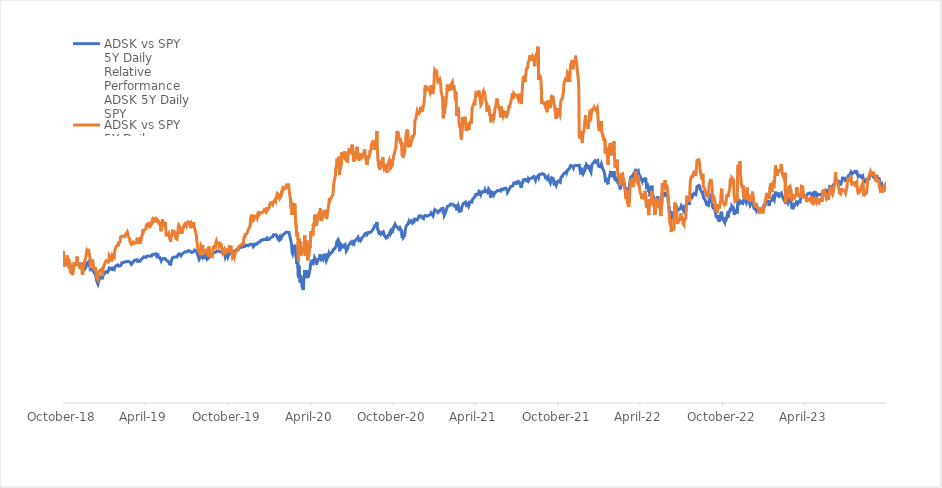
| Category | Series 0 | Series 1 |
|---|---|---|
| 2023-10-04 | 100 | 100 |
| 2023-10-03 | 99.196 | 98.174 |
| 2023-10-02 | 100.578 | 100.932 |
| 2023-09-29 | 100.57 | 99.928 |
| 2023-09-28 | 100.843 | 100.401 |
| 2023-09-27 | 100.252 | 97.691 |
| 2023-09-26 | 100.229 | 97.392 |
| 2023-09-25 | 101.728 | 99.329 |
| 2023-09-22 | 101.321 | 98.541 |
| 2023-09-21 | 101.554 | 98.551 |
| 2023-09-20 | 103.247 | 100.324 |
| 2023-09-19 | 104.226 | 102.415 |
| 2023-09-18 | 104.451 | 103.12 |
| 2023-09-15 | 104.376 | 103.038 |
| 2023-09-14 | 105.661 | 104.641 |
| 2023-09-13 | 104.777 | 102.511 |
| 2023-09-12 | 104.647 | 102.289 |
| 2023-09-11 | 105.247 | 105.641 |
| 2023-09-08 | 104.544 | 105.858 |
| 2023-09-07 | 104.395 | 106.737 |
| 2023-09-06 | 104.731 | 107.312 |
| 2023-09-05 | 105.467 | 105.989 |
| 2023-09-01 | 105.911 | 106.259 |
| 2023-08-31 | 105.721 | 107.186 |
| 2023-08-30 | 105.89 | 106.998 |
| 2023-08-29 | 105.485 | 105.96 |
| 2023-08-28 | 103.977 | 104.844 |
| 2023-08-25 | 103.329 | 104.279 |
| 2023-08-24 | 102.64 | 100.744 |
| 2023-08-23 | 104.04 | 98.696 |
| 2023-08-22 | 102.904 | 96.87 |
| 2023-08-21 | 103.19 | 97.566 |
| 2023-08-18 | 102.485 | 96.436 |
| 2023-08-17 | 102.5 | 95.963 |
| 2023-08-16 | 103.297 | 98.353 |
| 2023-08-15 | 104.083 | 101.193 |
| 2023-08-14 | 105.3 | 102.135 |
| 2023-08-11 | 104.698 | 100.435 |
| 2023-08-10 | 104.81 | 100.483 |
| 2023-08-09 | 104.784 | 98.894 |
| 2023-08-08 | 105.526 | 98.15 |
| 2023-08-07 | 105.973 | 98.385 |
| 2023-08-04 | 105.026 | 97.349 |
| 2023-08-03 | 105.585 | 97.856 |
| 2023-08-02 | 105.855 | 99.865 |
| 2023-08-01 | 107.34 | 102.603 |
| 2023-07-31 | 107.627 | 102.381 |
| 2023-07-28 | 107.469 | 101.318 |
| 2023-07-27 | 106.418 | 101.159 |
| 2023-07-26 | 107.106 | 102.748 |
| 2023-07-25 | 107.123 | 101.787 |
| 2023-07-24 | 106.822 | 101.676 |
| 2023-07-21 | 106.393 | 101.372 |
| 2023-07-20 | 106.359 | 101.888 |
| 2023-07-19 | 107.082 | 105.8 |
| 2023-07-18 | 106.83 | 104.916 |
| 2023-07-17 | 106.075 | 103.221 |
| 2023-07-14 | 105.668 | 103.419 |
| 2023-07-13 | 105.776 | 104.603 |
| 2023-07-12 | 104.888 | 103.989 |
| 2023-07-11 | 104.116 | 102.41 |
| 2023-07-10 | 103.419 | 100.13 |
| 2023-07-07 | 103.171 | 97.349 |
| 2023-07-06 | 103.467 | 97.097 |
| 2023-07-05 | 104.294 | 98.45 |
| 2023-07-03 | 104.499 | 98.377 |
| 2023-06-30 | 104.377 | 98.817 |
| 2023-06-29 | 103.112 | 99.575 |
| 2023-06-28 | 102.653 | 99.633 |
| 2023-06-27 | 102.689 | 99.899 |
| 2023-06-26 | 101.526 | 96.967 |
| 2023-06-23 | 101.984 | 97.556 |
| 2023-06-22 | 102.771 | 99.826 |
| 2023-06-21 | 102.391 | 100.444 |
| 2023-06-20 | 102.931 | 102.381 |
| 2023-06-16 | 103.42 | 103.11 |
| 2023-06-15 | 103.802 | 106.94 |
| 2023-06-14 | 102.553 | 103.134 |
| 2023-06-13 | 102.469 | 103.009 |
| 2023-06-12 | 101.763 | 100.502 |
| 2023-06-09 | 100.823 | 97.262 |
| 2023-06-08 | 100.708 | 96.668 |
| 2023-06-07 | 100.088 | 97.151 |
| 2023-06-06 | 100.471 | 100.459 |
| 2023-06-05 | 100.235 | 100.662 |
| 2023-06-02 | 100.437 | 98.638 |
| 2023-06-01 | 98.998 | 98.184 |
| 2023-05-31 | 98.032 | 96.296 |
| 2023-05-30 | 98.634 | 94.195 |
| 2023-05-26 | 98.633 | 96.059 |
| 2023-05-25 | 97.362 | 95.412 |
| 2023-05-24 | 96.517 | 95.021 |
| 2023-05-23 | 97.228 | 94.968 |
| 2023-05-22 | 98.332 | 98.276 |
| 2023-05-19 | 98.317 | 97.02 |
| 2023-05-18 | 98.459 | 98.928 |
| 2023-05-17 | 97.538 | 95.847 |
| 2023-05-16 | 96.392 | 93.33 |
| 2023-05-15 | 97.01 | 95.098 |
| 2023-05-12 | 96.724 | 93.91 |
| 2023-05-11 | 96.878 | 93.258 |
| 2023-05-10 | 97.042 | 94.813 |
| 2023-05-09 | 96.609 | 93.079 |
| 2023-05-08 | 97.054 | 92.722 |
| 2023-05-05 | 97.01 | 94.147 |
| 2023-05-04 | 95.25 | 93.224 |
| 2023-05-03 | 95.943 | 93.548 |
| 2023-05-02 | 96.619 | 92.93 |
| 2023-05-01 | 97.751 | 94.886 |
| 2023-04-28 | 97.789 | 94.074 |
| 2023-04-27 | 96.989 | 91.814 |
| 2023-04-26 | 95.127 | 91.713 |
| 2023-04-25 | 95.494 | 91.862 |
| 2023-04-24 | 97.028 | 94.581 |
| 2023-04-21 | 96.946 | 93.736 |
| 2023-04-20 | 96.858 | 94.002 |
| 2023-04-19 | 97.438 | 94.929 |
| 2023-04-18 | 97.446 | 95.359 |
| 2023-04-17 | 97.363 | 95.185 |
| 2023-04-14 | 97.042 | 94.011 |
| 2023-04-13 | 97.244 | 94.808 |
| 2023-04-12 | 95.971 | 93.287 |
| 2023-04-11 | 96.369 | 95.518 |
| 2023-04-10 | 96.373 | 95.692 |
| 2023-04-06 | 96.277 | 95.306 |
| 2023-04-05 | 95.934 | 95.407 |
| 2023-04-04 | 96.174 | 98.194 |
| 2023-04-03 | 96.734 | 100.251 |
| 2023-03-31 | 96.378 | 100.531 |
| 2023-03-30 | 95.006 | 97.368 |
| 2023-03-29 | 94.466 | 96.185 |
| 2023-03-28 | 93.14 | 95.272 |
| 2023-03-27 | 93.287 | 95.987 |
| 2023-03-24 | 93.134 | 96.697 |
| 2023-03-23 | 92.611 | 97.141 |
| 2023-03-22 | 92.336 | 95.808 |
| 2023-03-21 | 93.881 | 100.043 |
| 2023-03-20 | 92.678 | 96.793 |
| 2023-03-17 | 91.859 | 96.161 |
| 2023-03-16 | 92.883 | 96.875 |
| 2023-03-15 | 91.28 | 94.557 |
| 2023-03-14 | 91.921 | 96.214 |
| 2023-03-13 | 90.431 | 95.562 |
| 2023-03-10 | 90.568 | 93.702 |
| 2023-03-09 | 91.898 | 96.827 |
| 2023-03-08 | 93.627 | 98.768 |
| 2023-03-07 | 93.494 | 99.237 |
| 2023-03-06 | 94.95 | 100.613 |
| 2023-03-03 | 94.885 | 100.193 |
| 2023-03-02 | 93.377 | 97.136 |
| 2023-03-01 | 92.674 | 94.842 |
| 2023-02-28 | 93.114 | 95.958 |
| 2023-02-27 | 93.398 | 94.987 |
| 2023-02-24 | 93.111 | 92.983 |
| 2023-02-23 | 94.103 | 106.81 |
| 2023-02-22 | 93.604 | 104.656 |
| 2023-02-21 | 93.752 | 104.1 |
| 2023-02-17 | 95.669 | 106.24 |
| 2023-02-16 | 95.935 | 107.278 |
| 2023-02-15 | 97.276 | 110.731 |
| 2023-02-14 | 97.007 | 110.132 |
| 2023-02-13 | 97.034 | 108.181 |
| 2023-02-10 | 95.936 | 107.602 |
| 2023-02-09 | 95.726 | 108.495 |
| 2023-02-08 | 96.578 | 106.887 |
| 2023-02-07 | 97.661 | 108.012 |
| 2023-02-06 | 96.419 | 105.448 |
| 2023-02-03 | 97.015 | 108.017 |
| 2023-02-02 | 98.03 | 110.219 |
| 2023-02-01 | 96.61 | 107.307 |
| 2023-01-31 | 95.611 | 103.912 |
| 2023-01-30 | 94.231 | 100.995 |
| 2023-01-27 | 95.469 | 101.845 |
| 2023-01-26 | 95.231 | 100.676 |
| 2023-01-25 | 94.195 | 97.798 |
| 2023-01-24 | 94.212 | 99.696 |
| 2023-01-23 | 94.279 | 102.043 |
| 2023-01-20 | 93.172 | 99.44 |
| 2023-01-19 | 91.442 | 94.683 |
| 2023-01-18 | 92.146 | 95.634 |
| 2023-01-17 | 93.602 | 96.928 |
| 2023-01-13 | 93.793 | 96.875 |
| 2023-01-12 | 93.419 | 96.571 |
| 2023-01-11 | 93.101 | 96.557 |
| 2023-01-10 | 91.92 | 93.417 |
| 2023-01-09 | 91.283 | 92.954 |
| 2023-01-06 | 91.353 | 90.404 |
| 2023-01-05 | 89.313 | 87.931 |
| 2023-01-04 | 90.366 | 90.776 |
| 2023-01-03 | 89.69 | 89.419 |
| 2022-12-30 | 90.05 | 90.249 |
| 2022-12-29 | 90.279 | 90.853 |
| 2022-12-28 | 88.73 | 87.849 |
| 2022-12-27 | 89.809 | 89.969 |
| 2022-12-23 | 90.175 | 90.872 |
| 2022-12-22 | 89.649 | 90.843 |
| 2022-12-21 | 90.963 | 92.838 |
| 2022-12-20 | 89.63 | 90.756 |
| 2022-12-19 | 89.538 | 91.056 |
| 2022-12-16 | 90.351 | 92.92 |
| 2022-12-15 | 91.369 | 93.746 |
| 2022-12-14 | 93.704 | 96.619 |
| 2022-12-13 | 94.275 | 98.049 |
| 2022-12-12 | 93.593 | 96.532 |
| 2022-12-09 | 92.275 | 93.842 |
| 2022-12-08 | 92.958 | 94.963 |
| 2022-12-07 | 92.264 | 93.374 |
| 2022-12-06 | 92.436 | 93.987 |
| 2022-12-05 | 93.787 | 95.813 |
| 2022-12-02 | 95.496 | 97.126 |
| 2022-12-01 | 95.61 | 99.937 |
| 2022-11-30 | 95.693 | 97.532 |
| 2022-11-29 | 92.82 | 94.263 |
| 2022-11-28 | 92.968 | 94.345 |
| 2022-11-25 | 94.427 | 96.909 |
| 2022-11-23 | 94.453 | 95.175 |
| 2022-11-22 | 93.898 | 100.889 |
| 2022-11-21 | 92.64 | 99.73 |
| 2022-11-18 | 93.001 | 101.599 |
| 2022-11-17 | 92.561 | 103.68 |
| 2022-11-16 | 92.848 | 106.8 |
| 2022-11-15 | 93.62 | 112.19 |
| 2022-11-14 | 92.811 | 107.848 |
| 2022-11-11 | 93.648 | 110.499 |
| 2022-11-10 | 92.791 | 107.679 |
| 2022-11-09 | 87.917 | 93.987 |
| 2022-11-08 | 89.783 | 96.112 |
| 2022-11-07 | 89.283 | 94.118 |
| 2022-11-04 | 88.433 | 93.543 |
| 2022-11-03 | 87.245 | 93.799 |
| 2022-11-02 | 88.178 | 96.291 |
| 2022-11-01 | 90.439 | 103.376 |
| 2022-10-31 | 90.812 | 103.497 |
| 2022-10-28 | 91.494 | 104.506 |
| 2022-10-27 | 89.295 | 101.492 |
| 2022-10-26 | 89.841 | 103.622 |
| 2022-10-25 | 90.51 | 104.182 |
| 2022-10-24 | 89.061 | 100.014 |
| 2022-10-21 | 88.015 | 97.262 |
| 2022-10-20 | 85.975 | 95.542 |
| 2022-10-19 | 86.665 | 95.151 |
| 2022-10-18 | 87.247 | 96.928 |
| 2022-10-17 | 86.261 | 95.963 |
| 2022-10-14 | 84.036 | 91.669 |
| 2022-10-13 | 86.072 | 93.62 |
| 2022-10-12 | 83.894 | 93.519 |
| 2022-10-11 | 84.171 | 92.258 |
| 2022-10-10 | 84.723 | 92.258 |
| 2022-10-07 | 85.363 | 94.05 |
| 2022-10-06 | 87.822 | 99.425 |
| 2022-10-05 | 88.731 | 98.778 |
| 2022-10-04 | 88.911 | 96.586 |
| 2022-10-03 | 86.272 | 92.949 |
| 2022-09-30 | 84.095 | 90.215 |
| 2022-09-29 | 85.382 | 91.5 |
| 2022-09-28 | 87.225 | 92.234 |
| 2022-09-27 | 85.542 | 90.776 |
| 2022-09-26 | 85.724 | 88.858 |
| 2022-09-23 | 86.619 | 89.134 |
| 2022-09-22 | 88.138 | 90.384 |
| 2022-09-21 | 88.887 | 92.93 |
| 2022-09-20 | 90.435 | 94.161 |
| 2022-09-19 | 91.466 | 95.088 |
| 2022-09-16 | 90.843 | 94.161 |
| 2022-09-15 | 91.5 | 97.218 |
| 2022-09-14 | 92.548 | 100.705 |
| 2022-09-13 | 92.235 | 100.618 |
| 2022-09-12 | 96.404 | 103.912 |
| 2022-09-09 | 95.394 | 102.231 |
| 2022-09-08 | 93.959 | 101.333 |
| 2022-09-07 | 93.342 | 99.58 |
| 2022-09-06 | 91.661 | 95.711 |
| 2022-09-02 | 92.038 | 95.958 |
| 2022-09-01 | 93.037 | 97.532 |
| 2022-08-31 | 92.759 | 97.431 |
| 2022-08-30 | 93.49 | 97.947 |
| 2022-08-29 | 94.532 | 99.348 |
| 2022-08-26 | 95.166 | 100.343 |
| 2022-08-25 | 98.484 | 106.322 |
| 2022-08-24 | 97.116 | 103.559 |
| 2022-08-23 | 96.833 | 103.173 |
| 2022-08-22 | 97.05 | 104.511 |
| 2022-08-19 | 99.173 | 107.5 |
| 2022-08-18 | 100.469 | 110.528 |
| 2022-08-17 | 100.241 | 110.21 |
| 2022-08-16 | 100.972 | 112.837 |
| 2022-08-15 | 100.783 | 113.03 |
| 2022-08-12 | 100.385 | 112.533 |
| 2022-08-11 | 98.675 | 109.756 |
| 2022-08-10 | 98.745 | 109.302 |
| 2022-08-09 | 96.686 | 105.351 |
| 2022-08-08 | 97.099 | 106.583 |
| 2022-08-05 | 97.219 | 107.07 |
| 2022-08-04 | 97.378 | 107.186 |
| 2022-08-03 | 97.453 | 105.496 |
| 2022-08-02 | 95.953 | 104.405 |
| 2022-08-01 | 96.596 | 105.351 |
| 2022-07-29 | 96.87 | 104.472 |
| 2022-07-28 | 95.513 | 102.463 |
| 2022-07-27 | 94.368 | 98.237 |
| 2022-07-26 | 91.962 | 93.244 |
| 2022-07-25 | 93.036 | 94.518 |
| 2022-07-22 | 92.914 | 94.634 |
| 2022-07-21 | 93.79 | 96.156 |
| 2022-07-20 | 92.874 | 94.842 |
| 2022-07-19 | 92.329 | 89.23 |
| 2022-07-18 | 89.847 | 85.589 |
| 2022-07-15 | 90.605 | 85.101 |
| 2022-07-14 | 88.898 | 82.565 |
| 2022-07-13 | 89.165 | 82.561 |
| 2022-07-12 | 89.564 | 83.227 |
| 2022-07-11 | 90.4 | 85.347 |
| 2022-07-08 | 91.454 | 86.849 |
| 2022-07-07 | 91.53 | 88.018 |
| 2022-07-06 | 90.181 | 85.352 |
| 2022-07-05 | 89.86 | 85.434 |
| 2022-07-01 | 89.718 | 83.966 |
| 2022-06-30 | 88.781 | 83.048 |
| 2022-06-29 | 89.565 | 85.41 |
| 2022-06-28 | 89.629 | 85.391 |
| 2022-06-27 | 91.471 | 89.766 |
| 2022-06-24 | 91.744 | 92.959 |
| 2022-06-23 | 89.023 | 88.578 |
| 2022-06-22 | 88.183 | 81.691 |
| 2022-06-21 | 88.298 | 80.595 |
| 2022-06-17 | 86.188 | 81.025 |
| 2022-06-16 | 85.999 | 79.354 |
| 2022-06-15 | 88.889 | 85.342 |
| 2022-06-14 | 87.61 | 82.87 |
| 2022-06-13 | 87.942 | 83.599 |
| 2022-06-10 | 91.489 | 90.351 |
| 2022-06-09 | 94.232 | 94.205 |
| 2022-06-08 | 96.529 | 98.392 |
| 2022-06-07 | 97.583 | 100.053 |
| 2022-06-06 | 96.662 | 100.744 |
| 2022-06-03 | 96.36 | 100.633 |
| 2022-06-02 | 97.961 | 103.395 |
| 2022-06-01 | 96.188 | 100.155 |
| 2022-05-31 | 96.914 | 100.333 |
| 2022-05-27 | 97.525 | 102.086 |
| 2022-05-26 | 95.171 | 92.548 |
| 2022-05-25 | 93.315 | 90.085 |
| 2022-05-24 | 92.442 | 86.714 |
| 2022-05-23 | 93.198 | 88.626 |
| 2022-05-20 | 91.501 | 92.442 |
| 2022-05-19 | 91.487 | 93.557 |
| 2022-05-18 | 92.024 | 90.785 |
| 2022-05-17 | 95.898 | 94.485 |
| 2022-05-16 | 94.002 | 93.007 |
| 2022-05-13 | 94.374 | 95.175 |
| 2022-05-12 | 92.174 | 89.37 |
| 2022-05-11 | 92.294 | 87.26 |
| 2022-05-10 | 93.839 | 90.027 |
| 2022-05-09 | 93.609 | 89.984 |
| 2022-05-06 | 96.707 | 93.582 |
| 2022-05-05 | 97.259 | 95.813 |
| 2022-05-04 | 100.854 | 98.401 |
| 2022-05-03 | 97.93 | 93.316 |
| 2022-05-02 | 97.458 | 93.161 |
| 2022-04-29 | 96.908 | 91.413 |
| 2022-04-28 | 100.557 | 94.581 |
| 2022-04-27 | 98.129 | 87.158 |
| 2022-04-26 | 97.923 | 89.631 |
| 2022-04-25 | 100.759 | 92.316 |
| 2022-04-22 | 100.188 | 90.462 |
| 2022-04-21 | 103.047 | 94.238 |
| 2022-04-20 | 104.59 | 97.518 |
| 2022-04-19 | 104.655 | 98.426 |
| 2022-04-18 | 103.001 | 94.919 |
| 2022-04-14 | 103.022 | 95.011 |
| 2022-04-13 | 104.288 | 97.431 |
| 2022-04-12 | 103.136 | 94.726 |
| 2022-04-11 | 103.489 | 96.122 |
| 2022-04-08 | 105.266 | 97.677 |
| 2022-04-07 | 105.546 | 98.894 |
| 2022-04-06 | 105.099 | 98.493 |
| 2022-04-05 | 106.13 | 102.168 |
| 2022-04-04 | 107.479 | 105.655 |
| 2022-04-01 | 106.616 | 102.888 |
| 2022-03-31 | 106.254 | 103.521 |
| 2022-03-30 | 107.944 | 106.732 |
| 2022-03-29 | 108.627 | 107.698 |
| 2022-03-28 | 107.312 | 104.033 |
| 2022-03-25 | 106.551 | 102.453 |
| 2022-03-24 | 106.014 | 102.893 |
| 2022-03-23 | 104.515 | 100.135 |
| 2022-03-22 | 105.813 | 104.636 |
| 2022-03-21 | 104.63 | 102.569 |
| 2022-03-18 | 104.676 | 103.014 |
| 2022-03-17 | 103.469 | 102.217 |
| 2022-03-16 | 102.207 | 98.764 |
| 2022-03-15 | 99.97 | 92.934 |
| 2022-03-14 | 97.874 | 91.133 |
| 2022-03-11 | 98.606 | 92.876 |
| 2022-03-10 | 99.901 | 96.489 |
| 2022-03-09 | 100.331 | 98.947 |
| 2022-03-08 | 97.818 | 94.634 |
| 2022-03-07 | 98.53 | 96.151 |
| 2022-03-04 | 101.527 | 100.29 |
| 2022-03-03 | 102.339 | 101.42 |
| 2022-03-02 | 102.88 | 104.564 |
| 2022-03-01 | 100.997 | 103.352 |
| 2022-02-28 | 102.584 | 106.36 |
| 2022-02-25 | 102.836 | 106.066 |
| 2022-02-24 | 100.585 | 105.37 |
| 2022-02-23 | 99.103 | 100.947 |
| 2022-02-22 | 100.962 | 104.149 |
| 2022-02-18 | 101.996 | 104.723 |
| 2022-02-17 | 102.733 | 107.887 |
| 2022-02-16 | 104.955 | 112.885 |
| 2022-02-15 | 104.862 | 112.711 |
| 2022-02-14 | 103.235 | 109.582 |
| 2022-02-11 | 103.633 | 109.693 |
| 2022-02-10 | 105.637 | 115.194 |
| 2022-02-09 | 107.586 | 121.385 |
| 2022-02-08 | 106.046 | 116.44 |
| 2022-02-07 | 105.163 | 116.14 |
| 2022-02-04 | 105.553 | 116.507 |
| 2022-02-03 | 105.012 | 114.827 |
| 2022-02-02 | 107.637 | 119.772 |
| 2022-02-01 | 106.632 | 120.627 |
| 2022-01-31 | 105.906 | 120.637 |
| 2022-01-28 | 103.943 | 115.686 |
| 2022-01-27 | 101.472 | 110.432 |
| 2022-01-26 | 102.021 | 112.663 |
| 2022-01-25 | 102.174 | 112.904 |
| 2022-01-24 | 103.433 | 118.492 |
| 2022-01-21 | 103.147 | 115.517 |
| 2022-01-20 | 105.136 | 121.902 |
| 2022-01-19 | 106.309 | 122.839 |
| 2022-01-18 | 107.349 | 121.718 |
| 2022-01-14 | 109.36 | 125.133 |
| 2022-01-13 | 109.271 | 125.65 |
| 2022-01-12 | 110.85 | 130.204 |
| 2022-01-11 | 110.538 | 130.701 |
| 2022-01-10 | 109.535 | 126.722 |
| 2022-01-07 | 109.693 | 126.688 |
| 2022-01-06 | 110.139 | 127.552 |
| 2022-01-05 | 110.245 | 127.654 |
| 2022-01-04 | 112.425 | 134.352 |
| 2022-01-03 | 112.496 | 137.023 |
| 2021-12-31 | 111.784 | 135.801 |
| 2021-12-30 | 112.078 | 136.052 |
| 2021-12-29 | 112.414 | 136.468 |
| 2021-12-28 | 112.257 | 136.564 |
| 2021-12-27 | 112.37 | 137.303 |
| 2021-12-23 | 110.836 | 135.705 |
| 2021-12-22 | 110.151 | 136.487 |
| 2021-12-21 | 109.041 | 135.429 |
| 2021-12-20 | 107.136 | 132.87 |
| 2021-12-17 | 108.37 | 134.092 |
| 2021-12-16 | 109.497 | 130.209 |
| 2021-12-15 | 110.463 | 131.232 |
| 2021-12-14 | 108.686 | 127.123 |
| 2021-12-13 | 109.504 | 129.856 |
| 2021-12-10 | 110.514 | 129.914 |
| 2021-12-09 | 109.468 | 129.272 |
| 2021-12-08 | 110.26 | 133.435 |
| 2021-12-07 | 109.921 | 133.633 |
| 2021-12-06 | 107.691 | 128.253 |
| 2021-12-03 | 106.442 | 125.094 |
| 2021-12-02 | 107.349 | 124.437 |
| 2021-12-01 | 105.847 | 120.583 |
| 2021-11-30 | 107.112 | 122.762 |
| 2021-11-29 | 109.183 | 126.123 |
| 2021-11-26 | 107.76 | 122.752 |
| 2021-11-24 | 110.266 | 124.07 |
| 2021-11-23 | 110.013 | 146.817 |
| 2021-11-22 | 109.831 | 149.947 |
| 2021-11-19 | 110.184 | 155.762 |
| 2021-11-18 | 110.338 | 155.597 |
| 2021-11-17 | 109.966 | 159.64 |
| 2021-11-16 | 110.253 | 161.132 |
| 2021-11-15 | 109.828 | 157.631 |
| 2021-11-12 | 109.829 | 159.046 |
| 2021-11-11 | 109.042 | 157.061 |
| 2021-11-10 | 108.982 | 154.801 |
| 2021-11-09 | 109.886 | 159.084 |
| 2021-11-08 | 110.271 | 158.925 |
| 2021-11-05 | 110.174 | 156.728 |
| 2021-11-04 | 109.764 | 154.047 |
| 2021-11-03 | 109.307 | 148.928 |
| 2021-11-02 | 108.605 | 152.091 |
| 2021-11-01 | 108.207 | 152.135 |
| 2021-10-29 | 108.012 | 153.39 |
| 2021-10-28 | 107.802 | 153.144 |
| 2021-10-27 | 106.753 | 148.995 |
| 2021-10-26 | 107.295 | 151.067 |
| 2021-10-25 | 107.1 | 150.58 |
| 2021-10-22 | 106.594 | 149.029 |
| 2021-10-21 | 106.708 | 147.629 |
| 2021-10-20 | 106.39 | 144.229 |
| 2021-10-19 | 106.001 | 143.287 |
| 2021-10-18 | 105.223 | 141.346 |
| 2021-10-15 | 104.869 | 140.631 |
| 2021-10-14 | 104.093 | 139.655 |
| 2021-10-13 | 102.347 | 136.893 |
| 2021-10-12 | 102.038 | 133.251 |
| 2021-10-11 | 102.285 | 133.555 |
| 2021-10-08 | 102.992 | 134.715 |
| 2021-10-07 | 103.19 | 136.685 |
| 2021-10-06 | 102.341 | 133.98 |
| 2021-10-05 | 101.922 | 133.285 |
| 2021-10-04 | 100.861 | 131.812 |
| 2021-10-01 | 102.188 | 137.187 |
| 2021-09-30 | 101.027 | 137.723 |
| 2021-09-29 | 102.245 | 139.085 |
| 2021-09-28 | 102.085 | 139.018 |
| 2021-09-27 | 104.207 | 142.017 |
| 2021-09-24 | 104.497 | 142.311 |
| 2021-09-23 | 104.344 | 141.099 |
| 2021-09-22 | 103.093 | 138.327 |
| 2021-09-21 | 102.121 | 136.767 |
| 2021-09-20 | 102.204 | 136.965 |
| 2021-09-17 | 103.969 | 139.163 |
| 2021-09-16 | 104.925 | 140.384 |
| 2021-09-15 | 105.088 | 138.424 |
| 2021-09-14 | 104.205 | 134.913 |
| 2021-09-13 | 104.808 | 135.845 |
| 2021-09-10 | 104.569 | 137.366 |
| 2021-09-09 | 105.383 | 138.936 |
| 2021-09-08 | 105.871 | 139.844 |
| 2021-09-07 | 106.011 | 138.829 |
| 2021-09-03 | 106.372 | 139.452 |
| 2021-09-02 | 106.408 | 138.834 |
| 2021-09-01 | 106.106 | 146.45 |
| 2021-08-31 | 106.073 | 149.759 |
| 2021-08-30 | 106.216 | 151.352 |
| 2021-08-27 | 105.761 | 152.439 |
| 2021-08-26 | 104.837 | 149.807 |
| 2021-08-25 | 105.452 | 165.3 |
| 2021-08-24 | 105.218 | 164.72 |
| 2021-08-23 | 105.061 | 162.639 |
| 2021-08-20 | 104.173 | 161.489 |
| 2021-08-19 | 103.332 | 159.543 |
| 2021-08-18 | 103.202 | 156.245 |
| 2021-08-17 | 104.323 | 156.814 |
| 2021-08-16 | 105.065 | 159.461 |
| 2021-08-13 | 104.79 | 160.717 |
| 2021-08-12 | 104.622 | 160.364 |
| 2021-08-11 | 104.314 | 158.717 |
| 2021-08-10 | 104.057 | 159.992 |
| 2021-08-09 | 103.954 | 160.712 |
| 2021-08-06 | 104.052 | 160.712 |
| 2021-08-05 | 103.878 | 158.804 |
| 2021-08-04 | 103.258 | 158.935 |
| 2021-08-03 | 103.738 | 158.22 |
| 2021-08-02 | 102.894 | 155.544 |
| 2021-07-30 | 103.084 | 155.09 |
| 2021-07-29 | 103.645 | 154.786 |
| 2021-07-28 | 103.211 | 151.227 |
| 2021-07-27 | 103.23 | 148.87 |
| 2021-07-26 | 103.719 | 151.463 |
| 2021-07-23 | 103.472 | 150.995 |
| 2021-07-22 | 102.433 | 148.995 |
| 2021-07-21 | 102.227 | 145.745 |
| 2021-07-20 | 101.391 | 143.012 |
| 2021-07-19 | 99.877 | 138.757 |
| 2021-07-16 | 101.487 | 141.664 |
| 2021-07-15 | 102.258 | 142.369 |
| 2021-07-14 | 102.593 | 143.485 |
| 2021-07-13 | 102.473 | 143.157 |
| 2021-07-12 | 102.835 | 140.988 |
| 2021-07-09 | 102.481 | 142.654 |
| 2021-07-08 | 101.338 | 142.215 |
| 2021-07-07 | 102.214 | 143.007 |
| 2021-07-06 | 101.871 | 142.761 |
| 2021-07-02 | 102.078 | 143.794 |
| 2021-07-01 | 101.318 | 141.843 |
| 2021-06-30 | 100.792 | 140.974 |
| 2021-06-29 | 100.658 | 143.794 |
| 2021-06-28 | 100.63 | 141.679 |
| 2021-06-25 | 100.398 | 139.448 |
| 2021-06-24 | 100.064 | 138.588 |
| 2021-06-23 | 99.486 | 136.999 |
| 2021-06-22 | 99.594 | 138.158 |
| 2021-06-21 | 99.086 | 136.782 |
| 2021-06-18 | 97.718 | 134.251 |
| 2021-06-17 | 99.018 | 133.459 |
| 2021-06-16 | 99.061 | 132.189 |
| 2021-06-15 | 99.598 | 133.662 |
| 2021-06-14 | 99.798 | 135.478 |
| 2021-06-11 | 99.617 | 134.024 |
| 2021-06-10 | 99.424 | 134.019 |
| 2021-06-09 | 98.963 | 133.053 |
| 2021-06-08 | 99.144 | 134.579 |
| 2021-06-07 | 99.127 | 134.69 |
| 2021-06-04 | 99.206 | 137.535 |
| 2021-06-03 | 98.337 | 132.556 |
| 2021-06-02 | 98.695 | 135.067 |
| 2021-06-01 | 98.553 | 135.854 |
| 2021-05-28 | 98.601 | 138.057 |
| 2021-05-27 | 98.525 | 138.448 |
| 2021-05-26 | 98.411 | 141.268 |
| 2021-05-25 | 98.226 | 139.8 |
| 2021-05-24 | 98.436 | 138.839 |
| 2021-05-21 | 97.47 | 136.038 |
| 2021-05-20 | 97.546 | 135.787 |
| 2021-05-19 | 96.527 | 132.314 |
| 2021-05-18 | 96.812 | 131.725 |
| 2021-05-17 | 97.644 | 132.705 |
| 2021-05-14 | 97.892 | 134.082 |
| 2021-05-13 | 96.453 | 130.262 |
| 2021-05-12 | 95.293 | 130.175 |
| 2021-05-11 | 97.381 | 133.98 |
| 2021-05-10 | 98.233 | 133.319 |
| 2021-05-07 | 99.269 | 138.008 |
| 2021-05-06 | 98.543 | 137.327 |
| 2021-05-05 | 97.745 | 135.748 |
| 2021-05-04 | 97.676 | 135.096 |
| 2021-05-03 | 98.333 | 138.849 |
| 2021-04-30 | 98.063 | 140.978 |
| 2021-04-29 | 98.774 | 143.089 |
| 2021-04-28 | 98.11 | 144.514 |
| 2021-04-27 | 98.193 | 143.857 |
| 2021-04-26 | 98.214 | 144.567 |
| 2021-04-23 | 98.04 | 142.601 |
| 2021-04-22 | 96.98 | 139.09 |
| 2021-04-21 | 97.881 | 139.51 |
| 2021-04-20 | 96.979 | 138.298 |
| 2021-04-19 | 97.643 | 140.153 |
| 2021-04-16 | 98.164 | 144.963 |
| 2021-04-15 | 97.811 | 144.335 |
| 2021-04-14 | 96.738 | 142.157 |
| 2021-04-13 | 97.135 | 142.64 |
| 2021-04-12 | 96.816 | 142.229 |
| 2021-04-09 | 96.835 | 143.712 |
| 2021-04-08 | 96.093 | 141.713 |
| 2021-04-07 | 95.689 | 138.182 |
| 2021-04-06 | 95.548 | 137.883 |
| 2021-04-05 | 95.641 | 139.245 |
| 2021-04-01 | 94.28 | 137.11 |
| 2021-03-31 | 93.178 | 133.85 |
| 2021-03-30 | 92.842 | 129.639 |
| 2021-03-29 | 93.136 | 130.774 |
| 2021-03-26 | 93.217 | 129.919 |
| 2021-03-25 | 91.692 | 126.625 |
| 2021-03-24 | 91.214 | 127.103 |
| 2021-03-23 | 91.716 | 129.914 |
| 2021-03-22 | 92.421 | 128.446 |
| 2021-03-19 | 91.776 | 126.292 |
| 2021-03-18 | 91.831 | 127.229 |
| 2021-03-17 | 93.207 | 131.769 |
| 2021-03-16 | 92.94 | 132.817 |
| 2021-03-15 | 93.086 | 131.856 |
| 2021-03-12 | 92.485 | 129.484 |
| 2021-03-11 | 92.391 | 132.503 |
| 2021-03-10 | 91.441 | 127.325 |
| 2021-03-09 | 90.893 | 127.485 |
| 2021-03-08 | 89.624 | 122.235 |
| 2021-03-05 | 90.107 | 129.136 |
| 2021-03-04 | 88.384 | 128.195 |
| 2021-03-03 | 89.586 | 130.059 |
| 2021-03-02 | 90.772 | 134.222 |
| 2021-03-01 | 91.511 | 137.289 |
| 2021-02-26 | 89.385 | 133.295 |
| 2021-02-25 | 89.812 | 137.173 |
| 2021-02-24 | 92.065 | 144.359 |
| 2021-02-23 | 91.032 | 140.177 |
| 2021-02-22 | 90.918 | 143.775 |
| 2021-02-19 | 91.626 | 147.493 |
| 2021-02-18 | 91.796 | 145.233 |
| 2021-02-17 | 92.204 | 146.103 |
| 2021-02-16 | 92.233 | 148.855 |
| 2021-02-12 | 92.286 | 147.368 |
| 2021-02-11 | 91.853 | 144.987 |
| 2021-02-10 | 91.7 | 145.711 |
| 2021-02-09 | 91.732 | 147.059 |
| 2021-02-08 | 91.834 | 146.243 |
| 2021-02-05 | 91.16 | 147.716 |
| 2021-02-04 | 90.806 | 145.122 |
| 2021-02-03 | 89.831 | 141.432 |
| 2021-02-02 | 89.74 | 142.282 |
| 2021-02-01 | 88.51 | 138.279 |
| 2021-01-29 | 87.112 | 133.985 |
| 2021-01-28 | 88.827 | 137.265 |
| 2021-01-27 | 87.969 | 132.073 |
| 2021-01-26 | 90.287 | 140.901 |
| 2021-01-25 | 90.422 | 141.814 |
| 2021-01-22 | 90.096 | 144.485 |
| 2021-01-21 | 90.368 | 148.005 |
| 2021-01-20 | 90.339 | 149.029 |
| 2021-01-19 | 89.098 | 150.184 |
| 2021-01-15 | 88.379 | 148.995 |
| 2021-01-14 | 89.019 | 150.251 |
| 2021-01-13 | 89.354 | 151.806 |
| 2021-01-12 | 89.151 | 154.607 |
| 2021-01-11 | 89.114 | 153.487 |
| 2021-01-08 | 89.702 | 154.472 |
| 2021-01-07 | 89.212 | 152.226 |
| 2021-01-06 | 87.907 | 146.272 |
| 2021-01-05 | 87.408 | 145.707 |
| 2021-01-04 | 86.793 | 143.359 |
| 2020-12-31 | 88.093 | 147.465 |
| 2020-12-30 | 87.53 | 144.601 |
| 2020-12-29 | 87.412 | 143.973 |
| 2020-12-28 | 87.607 | 144.717 |
| 2020-12-24 | 86.85 | 145.557 |
| 2020-12-23 | 86.544 | 144.972 |
| 2020-12-22 | 86.479 | 146.75 |
| 2020-12-21 | 86.659 | 145.311 |
| 2020-12-18 | 86.999 | 147.3 |
| 2020-12-17 | 87.305 | 143.606 |
| 2020-12-16 | 86.806 | 141.104 |
| 2020-12-15 | 86.652 | 138.863 |
| 2020-12-14 | 85.547 | 139.249 |
| 2020-12-11 | 85.921 | 135.072 |
| 2020-12-10 | 86.03 | 135.787 |
| 2020-12-09 | 86.141 | 134.946 |
| 2020-12-08 | 86.831 | 137.342 |
| 2020-12-07 | 86.59 | 135.613 |
| 2020-12-04 | 86.757 | 134.261 |
| 2020-12-03 | 85.998 | 133.918 |
| 2020-12-02 | 86.051 | 133.807 |
| 2020-12-01 | 85.897 | 134.797 |
| 2020-11-30 | 84.94 | 135.338 |
| 2020-11-27 | 85.332 | 131.754 |
| 2020-11-25 | 85.128 | 130.996 |
| 2020-11-24 | 85.263 | 125.07 |
| 2020-11-23 | 83.907 | 124.239 |
| 2020-11-20 | 83.437 | 123.1 |
| 2020-11-19 | 84.008 | 124.061 |
| 2020-11-18 | 83.677 | 121.81 |
| 2020-11-17 | 84.656 | 122.047 |
| 2020-11-16 | 85.064 | 120.154 |
| 2020-11-13 | 84.084 | 121.221 |
| 2020-11-12 | 82.955 | 118.666 |
| 2020-11-11 | 83.791 | 119.188 |
| 2020-11-10 | 83.155 | 119.395 |
| 2020-11-09 | 83.272 | 126.828 |
| 2020-11-06 | 82.309 | 125.283 |
| 2020-11-05 | 82.332 | 123.597 |
| 2020-11-04 | 80.761 | 118.753 |
| 2020-11-03 | 79.015 | 119.922 |
| 2020-11-02 | 77.637 | 116.266 |
| 2020-10-30 | 76.692 | 113.754 |
| 2020-10-29 | 77.634 | 117.28 |
| 2020-10-28 | 76.717 | 114.759 |
| 2020-10-27 | 79.523 | 121.028 |
| 2020-10-26 | 79.765 | 120.318 |
| 2020-10-23 | 81.276 | 122.873 |
| 2020-10-22 | 80.997 | 122.071 |
| 2020-10-21 | 80.576 | 122.675 |
| 2020-10-20 | 80.753 | 124.283 |
| 2020-10-19 | 80.373 | 125.538 |
| 2020-10-16 | 81.708 | 125.553 |
| 2020-10-15 | 81.697 | 121.718 |
| 2020-10-14 | 81.822 | 119.144 |
| 2020-10-13 | 82.367 | 117.884 |
| 2020-10-12 | 82.89 | 116.932 |
| 2020-10-09 | 81.551 | 114.701 |
| 2020-10-08 | 80.84 | 113.16 |
| 2020-10-07 | 80.198 | 112.533 |
| 2020-10-06 | 78.826 | 110.118 |
| 2020-10-05 | 79.944 | 110.562 |
| 2020-10-02 | 78.533 | 108.935 |
| 2020-10-01 | 79.292 | 112.991 |
| 2020-09-30 | 78.874 | 111.567 |
| 2020-09-29 | 78.229 | 112.489 |
| 2020-09-28 | 78.607 | 112.117 |
| 2020-09-25 | 77.361 | 110.016 |
| 2020-09-24 | 76.144 | 106.713 |
| 2020-09-23 | 75.917 | 107.153 |
| 2020-09-22 | 77.762 | 110.866 |
| 2020-09-21 | 76.952 | 109.939 |
| 2020-09-18 | 77.853 | 108.727 |
| 2020-09-17 | 78.734 | 109.616 |
| 2020-09-16 | 79.402 | 111.446 |
| 2020-09-15 | 79.77 | 113.914 |
| 2020-09-14 | 79.356 | 110.997 |
| 2020-09-11 | 78.358 | 109.862 |
| 2020-09-10 | 78.316 | 110.21 |
| 2020-09-09 | 79.718 | 112.422 |
| 2020-09-08 | 78.143 | 108.355 |
| 2020-09-04 | 80.374 | 112.953 |
| 2020-09-03 | 81.033 | 116.918 |
| 2020-09-02 | 83.983 | 126.219 |
| 2020-09-01 | 82.712 | 122.433 |
| 2020-08-31 | 82.095 | 118.661 |
| 2020-08-28 | 82.275 | 119.477 |
| 2020-08-27 | 81.725 | 117.41 |
| 2020-08-26 | 81.589 | 119.873 |
| 2020-08-25 | 80.765 | 121.82 |
| 2020-08-24 | 80.476 | 121.607 |
| 2020-08-21 | 79.675 | 119.902 |
| 2020-08-20 | 79.402 | 120.327 |
| 2020-08-19 | 79.152 | 116.594 |
| 2020-08-18 | 79.502 | 117.208 |
| 2020-08-17 | 79.32 | 115.425 |
| 2020-08-14 | 79.105 | 113.18 |
| 2020-08-13 | 79.119 | 115.034 |
| 2020-08-12 | 79.281 | 111.837 |
| 2020-08-11 | 78.187 | 110.495 |
| 2020-08-10 | 78.815 | 111.987 |
| 2020-08-07 | 78.599 | 114.093 |
| 2020-08-06 | 78.55 | 117.633 |
| 2020-08-05 | 78.048 | 117.454 |
| 2020-08-04 | 77.549 | 115.86 |
| 2020-08-03 | 77.27 | 115.657 |
| 2020-07-31 | 76.719 | 114.184 |
| 2020-07-30 | 76.135 | 114.025 |
| 2020-07-29 | 76.422 | 115.237 |
| 2020-07-28 | 75.484 | 113.291 |
| 2020-07-27 | 75.976 | 115.759 |
| 2020-07-24 | 75.418 | 112.47 |
| 2020-07-23 | 75.888 | 114.624 |
| 2020-07-22 | 76.834 | 116.266 |
| 2020-07-21 | 76.395 | 115.759 |
| 2020-07-20 | 76.267 | 118.825 |
| 2020-07-17 | 75.631 | 114.798 |
| 2020-07-16 | 75.416 | 113.025 |
| 2020-07-15 | 75.674 | 113.774 |
| 2020-07-14 | 74.993 | 113.3 |
| 2020-07-13 | 74.001 | 111.977 |
| 2020-07-10 | 74.7 | 117.956 |
| 2020-07-09 | 73.927 | 119.869 |
| 2020-07-08 | 74.346 | 117.792 |
| 2020-07-07 | 73.769 | 115.397 |
| 2020-07-06 | 74.576 | 118.014 |
| 2020-07-02 | 73.41 | 115.981 |
| 2020-07-01 | 73.078 | 116.498 |
| 2020-06-30 | 72.713 | 115.517 |
| 2020-06-29 | 71.609 | 112.127 |
| 2020-06-26 | 70.573 | 112.402 |
| 2020-06-25 | 72.325 | 113.238 |
| 2020-06-24 | 71.541 | 112.74 |
| 2020-06-23 | 73.44 | 116.691 |
| 2020-06-22 | 73.125 | 116.333 |
| 2020-06-19 | 72.653 | 114.856 |
| 2020-06-18 | 73.066 | 114.976 |
| 2020-06-17 | 73.022 | 114.479 |
| 2020-06-16 | 73.286 | 116.358 |
| 2020-06-15 | 71.922 | 110.596 |
| 2020-06-12 | 71.329 | 107.679 |
| 2020-06-11 | 70.41 | 105.815 |
| 2020-06-10 | 74.82 | 114.262 |
| 2020-06-09 | 75.22 | 113.083 |
| 2020-06-08 | 75.811 | 112.774 |
| 2020-06-05 | 74.909 | 112.871 |
| 2020-06-04 | 72.996 | 108.761 |
| 2020-06-03 | 73.242 | 109.335 |
| 2020-06-02 | 72.256 | 105.81 |
| 2020-06-01 | 71.668 | 105.907 |
| 2020-05-29 | 71.4 | 101.603 |
| 2020-05-28 | 71.058 | 97.861 |
| 2020-05-27 | 71.208 | 96.499 |
| 2020-05-26 | 70.168 | 96.363 |
| 2020-05-22 | 69.316 | 94.552 |
| 2020-05-21 | 69.153 | 94.055 |
| 2020-05-20 | 69.695 | 94.968 |
| 2020-05-19 | 68.553 | 94.036 |
| 2020-05-18 | 69.28 | 91.809 |
| 2020-05-15 | 67.164 | 87.279 |
| 2020-05-14 | 66.901 | 85.903 |
| 2020-05-13 | 66.139 | 85.415 |
| 2020-05-12 | 67.314 | 87.4 |
| 2020-05-11 | 68.726 | 89.056 |
| 2020-05-08 | 68.714 | 89.003 |
| 2020-05-07 | 67.574 | 88.863 |
| 2020-05-06 | 66.806 | 87.525 |
| 2020-05-05 | 67.275 | 87.168 |
| 2020-05-04 | 66.672 | 85.869 |
| 2020-05-01 | 66.39 | 84.468 |
| 2020-04-30 | 68.307 | 90.375 |
| 2020-04-29 | 68.942 | 90.747 |
| 2020-04-28 | 67.157 | 85.632 |
| 2020-04-27 | 67.511 | 88.144 |
| 2020-04-24 | 66.532 | 87.1 |
| 2020-04-23 | 65.618 | 84.782 |
| 2020-04-22 | 65.654 | 84.695 |
| 2020-04-21 | 64.182 | 82.111 |
| 2020-04-20 | 66.213 | 85.903 |
| 2020-04-17 | 67.419 | 87.385 |
| 2020-04-16 | 65.659 | 82.585 |
| 2020-04-15 | 65.28 | 81.686 |
| 2020-04-14 | 66.75 | 83.174 |
| 2020-04-13 | 64.77 | 77.717 |
| 2020-04-09 | 65.431 | 79.639 |
| 2020-04-08 | 64.497 | 76.891 |
| 2020-04-07 | 62.373 | 71.815 |
| 2020-04-06 | 62.473 | 73.563 |
| 2020-04-03 | 58.368 | 67.13 |
| 2020-04-02 | 59.265 | 66.189 |
| 2020-04-01 | 57.942 | 67.237 |
| 2020-03-31 | 60.618 | 75.389 |
| 2020-03-30 | 61.604 | 75.297 |
| 2020-03-27 | 59.606 | 68.371 |
| 2020-03-26 | 61.684 | 77.697 |
| 2020-03-25 | 58.061 | 72.438 |
| 2020-03-24 | 57.399 | 72.423 |
| 2020-03-23 | 52.475 | 69.613 |
| 2020-03-20 | 54.059 | 71.487 |
| 2020-03-19 | 56.509 | 72.071 |
| 2020-03-18 | 56.244 | 68.492 |
| 2020-03-17 | 59.318 | 74.819 |
| 2020-03-16 | 55.963 | 71.516 |
| 2020-03-13 | 63.583 | 76.321 |
| 2020-03-12 | 58.18 | 65.681 |
| 2020-03-11 | 64.295 | 74.568 |
| 2020-03-10 | 67.598 | 79.436 |
| 2020-03-09 | 64.417 | 77.296 |
| 2020-03-06 | 69.713 | 83.754 |
| 2020-03-05 | 70.922 | 88.882 |
| 2020-03-04 | 73.412 | 92.447 |
| 2020-03-03 | 70.44 | 87.197 |
| 2020-03-02 | 72.477 | 92.162 |
| 2020-02-28 | 69.287 | 92.186 |
| 2020-02-27 | 69.862 | 87.245 |
| 2020-02-26 | 73.09 | 92.084 |
| 2020-02-25 | 73.368 | 90.182 |
| 2020-02-24 | 75.659 | 93.871 |
| 2020-02-21 | 78.282 | 97.513 |
| 2020-02-20 | 79.114 | 99.812 |
| 2020-02-19 | 79.417 | 101.787 |
| 2020-02-18 | 79.045 | 100 |
| 2020-02-14 | 79.277 | 100.913 |
| 2020-02-13 | 79.131 | 100.217 |
| 2020-02-12 | 79.26 | 100.024 |
| 2020-02-11 | 78.751 | 99.391 |
| 2020-02-10 | 78.618 | 99.536 |
| 2020-02-07 | 78.047 | 99.976 |
| 2020-02-06 | 78.47 | 99.488 |
| 2020-02-05 | 78.21 | 97.595 |
| 2020-02-04 | 77.34 | 98.493 |
| 2020-02-03 | 76.199 | 96.233 |
| 2020-01-31 | 75.65 | 95.069 |
| 2020-01-30 | 77.013 | 96.103 |
| 2020-01-29 | 76.773 | 96.465 |
| 2020-01-28 | 76.839 | 96.605 |
| 2020-01-27 | 76.075 | 94.596 |
| 2020-01-24 | 77.29 | 96.199 |
| 2020-01-23 | 77.996 | 95.914 |
| 2020-01-22 | 77.907 | 94.045 |
| 2020-01-21 | 77.884 | 94.581 |
| 2020-01-17 | 78.091 | 93.379 |
| 2020-01-16 | 77.791 | 92.968 |
| 2020-01-15 | 77.145 | 92.142 |
| 2020-01-14 | 77.001 | 92.297 |
| 2020-01-13 | 77.118 | 92.944 |
| 2020-01-10 | 76.584 | 92.901 |
| 2020-01-09 | 76.803 | 92.698 |
| 2020-01-08 | 76.296 | 91.737 |
| 2020-01-07 | 75.923 | 90.553 |
| 2020-01-06 | 76.137 | 90.37 |
| 2020-01-03 | 75.869 | 89.322 |
| 2020-01-02 | 76.408 | 90.713 |
| 2019-12-31 | 75.773 | 88.602 |
| 2019-12-30 | 75.551 | 88.525 |
| 2019-12-27 | 75.99 | 89.53 |
| 2019-12-26 | 75.987 | 88.979 |
| 2019-12-24 | 75.6 | 88.82 |
| 2019-12-23 | 75.614 | 88.342 |
| 2019-12-20 | 75.549 | 88.303 |
| 2019-12-19 | 75.177 | 88.757 |
| 2019-12-18 | 74.844 | 88.742 |
| 2019-12-17 | 74.876 | 87.651 |
| 2019-12-16 | 74.851 | 89.042 |
| 2019-12-13 | 74.32 | 86.646 |
| 2019-12-12 | 74.314 | 85.917 |
| 2019-12-11 | 73.682 | 86.757 |
| 2019-12-10 | 73.469 | 86.188 |
| 2019-12-09 | 73.549 | 86.366 |
| 2019-12-06 | 73.783 | 86.603 |
| 2019-12-05 | 73.115 | 85.304 |
| 2019-12-04 | 73.005 | 85.193 |
| 2019-12-03 | 72.546 | 84.71 |
| 2019-12-02 | 73.031 | 84.821 |
| 2019-11-29 | 73.667 | 87.366 |
| 2019-11-27 | 73.964 | 87.018 |
| 2019-11-26 | 73.656 | 82.488 |
| 2019-11-25 | 73.495 | 81.561 |
| 2019-11-22 | 72.947 | 80.658 |
| 2019-11-21 | 72.789 | 79.711 |
| 2019-11-20 | 72.904 | 79.846 |
| 2019-11-19 | 73.179 | 79.46 |
| 2019-11-18 | 73.223 | 78.451 |
| 2019-11-15 | 73.186 | 78.117 |
| 2019-11-14 | 72.627 | 76.374 |
| 2019-11-13 | 72.566 | 76.891 |
| 2019-11-12 | 72.515 | 76.335 |
| 2019-11-11 | 72.401 | 73.853 |
| 2019-11-08 | 72.544 | 73.872 |
| 2019-11-07 | 72.358 | 73.322 |
| 2019-11-06 | 72.161 | 73.172 |
| 2019-11-05 | 72.111 | 73.278 |
| 2019-11-04 | 72.196 | 73.056 |
| 2019-11-01 | 71.93 | 72.564 |
| 2019-10-31 | 71.242 | 71.168 |
| 2019-10-30 | 71.458 | 71.854 |
| 2019-10-29 | 71.226 | 70.313 |
| 2019-10-28 | 71.285 | 70.989 |
| 2019-10-25 | 70.889 | 70.289 |
| 2019-10-24 | 70.602 | 70.207 |
| 2019-10-23 | 70.467 | 68.545 |
| 2019-10-22 | 70.267 | 67.647 |
| 2019-10-21 | 70.518 | 68.333 |
| 2019-10-18 | 70.037 | 67.454 |
| 2019-10-17 | 70.313 | 69.675 |
| 2019-10-16 | 70.119 | 70.212 |
| 2019-10-15 | 70.259 | 72.443 |
| 2019-10-14 | 69.567 | 72.573 |
| 2019-10-11 | 69.663 | 72.597 |
| 2019-10-10 | 68.91 | 69.898 |
| 2019-10-09 | 68.47 | 71.656 |
| 2019-10-08 | 67.852 | 70.342 |
| 2019-10-07 | 68.925 | 71.264 |
| 2019-10-04 | 69.235 | 70.941 |
| 2019-10-03 | 68.265 | 69.917 |
| 2019-10-02 | 67.725 | 68.985 |
| 2019-10-01 | 68.959 | 70.371 |
| 2019-09-30 | 69.815 | 71.332 |
| 2019-09-27 | 69.464 | 70.12 |
| 2019-09-26 | 69.836 | 71.994 |
| 2019-09-25 | 70.006 | 71.202 |
| 2019-09-24 | 69.577 | 72.023 |
| 2019-09-23 | 70.168 | 73.587 |
| 2019-09-20 | 70.175 | 74.056 |
| 2019-09-19 | 70.52 | 74.075 |
| 2019-09-18 | 70.518 | 72.979 |
| 2019-09-17 | 70.494 | 74.215 |
| 2019-09-16 | 70.313 | 74.312 |
| 2019-09-13 | 70.534 | 74.123 |
| 2019-09-12 | 70.585 | 75.191 |
| 2019-09-11 | 70.382 | 74.698 |
| 2019-09-10 | 69.877 | 71.501 |
| 2019-09-09 | 69.855 | 72.935 |
| 2019-09-06 | 69.861 | 72.612 |
| 2019-09-05 | 69.798 | 71.583 |
| 2019-09-04 | 68.901 | 69.709 |
| 2019-09-03 | 68.162 | 68.169 |
| 2019-08-30 | 68.636 | 68.975 |
| 2019-08-29 | 68.592 | 68.883 |
| 2019-08-28 | 67.732 | 67.652 |
| 2019-08-27 | 67.292 | 72.544 |
| 2019-08-26 | 67.508 | 71.38 |
| 2019-08-23 | 66.775 | 69.54 |
| 2019-08-22 | 68.554 | 70.129 |
| 2019-08-21 | 68.588 | 70.487 |
| 2019-08-20 | 68.027 | 70.781 |
| 2019-08-19 | 68.57 | 70.598 |
| 2019-08-16 | 67.75 | 69.608 |
| 2019-08-15 | 66.786 | 69.023 |
| 2019-08-14 | 66.622 | 70.955 |
| 2019-08-13 | 68.633 | 73.317 |
| 2019-08-12 | 67.619 | 71.897 |
| 2019-08-09 | 68.453 | 73.09 |
| 2019-08-08 | 68.909 | 73.452 |
| 2019-08-07 | 67.64 | 69.627 |
| 2019-08-06 | 67.588 | 69.386 |
| 2019-08-05 | 66.719 | 69.337 |
| 2019-08-02 | 68.767 | 71.361 |
| 2019-08-01 | 69.271 | 74.119 |
| 2019-07-31 | 69.9 | 75.423 |
| 2019-07-30 | 70.67 | 77.412 |
| 2019-07-29 | 70.852 | 78.61 |
| 2019-07-26 | 70.967 | 81.131 |
| 2019-07-25 | 70.447 | 82.063 |
| 2019-07-24 | 70.819 | 83.797 |
| 2019-07-23 | 70.489 | 81.976 |
| 2019-07-22 | 70.009 | 82.276 |
| 2019-07-19 | 69.812 | 81.769 |
| 2019-07-18 | 70.246 | 83.251 |
| 2019-07-17 | 69.995 | 82.884 |
| 2019-07-16 | 70.455 | 82.59 |
| 2019-07-15 | 70.696 | 83.894 |
| 2019-07-12 | 70.684 | 84.125 |
| 2019-07-11 | 70.358 | 83.71 |
| 2019-07-10 | 70.198 | 83.425 |
| 2019-07-09 | 69.883 | 82.754 |
| 2019-07-08 | 69.797 | 82.039 |
| 2019-07-05 | 70.136 | 83.179 |
| 2019-07-03 | 70.263 | 83.068 |
| 2019-07-02 | 69.728 | 82.15 |
| 2019-07-01 | 69.524 | 81.759 |
| 2019-06-28 | 68.995 | 78.673 |
| 2019-06-27 | 68.6 | 79.808 |
| 2019-06-26 | 68.338 | 78.47 |
| 2019-06-25 | 68.423 | 78.798 |
| 2019-06-24 | 69.079 | 81.377 |
| 2019-06-21 | 69.199 | 82.532 |
| 2019-06-20 | 69.286 | 81.836 |
| 2019-06-19 | 68.636 | 79.991 |
| 2019-06-18 | 68.432 | 78.19 |
| 2019-06-17 | 67.773 | 76.007 |
| 2019-06-14 | 67.71 | 76.384 |
| 2019-06-13 | 67.819 | 78.393 |
| 2019-06-12 | 67.542 | 79.093 |
| 2019-06-11 | 67.68 | 78.818 |
| 2019-06-10 | 67.704 | 79.745 |
| 2019-06-07 | 67.39 | 79.832 |
| 2019-06-06 | 66.69 | 77.833 |
| 2019-06-05 | 66.283 | 77.905 |
| 2019-06-04 | 65.747 | 77.229 |
| 2019-06-03 | 64.367 | 74.771 |
| 2019-05-31 | 64.546 | 77.712 |
| 2019-05-30 | 65.409 | 78.538 |
| 2019-05-29 | 65.272 | 78.006 |
| 2019-05-28 | 65.726 | 77.799 |
| 2019-05-24 | 66.281 | 77.861 |
| 2019-05-23 | 66.191 | 81.88 |
| 2019-05-22 | 66.99 | 84.048 |
| 2019-05-21 | 67.179 | 84.145 |
| 2019-05-20 | 66.613 | 82.396 |
| 2019-05-17 | 67.066 | 84.193 |
| 2019-05-16 | 67.46 | 85.328 |
| 2019-05-15 | 66.865 | 83.705 |
| 2019-05-14 | 66.477 | 82.082 |
| 2019-05-13 | 65.948 | 79.653 |
| 2019-05-10 | 67.579 | 83.923 |
| 2019-05-09 | 67.329 | 82.788 |
| 2019-05-08 | 67.533 | 82.831 |
| 2019-05-07 | 67.641 | 82.45 |
| 2019-05-06 | 68.777 | 84.652 |
| 2019-05-03 | 69.086 | 85.338 |
| 2019-05-02 | 68.426 | 83.725 |
| 2019-05-01 | 68.572 | 84.019 |
| 2019-04-30 | 69.09 | 86.067 |
| 2019-04-29 | 69.024 | 85.328 |
| 2019-04-26 | 68.951 | 85.478 |
| 2019-04-25 | 68.629 | 84.671 |
| 2019-04-24 | 68.654 | 85.149 |
| 2019-04-23 | 68.805 | 84.652 |
| 2019-04-22 | 68.202 | 83.14 |
| 2019-04-18 | 68.133 | 81.715 |
| 2019-04-17 | 68.026 | 81.15 |
| 2019-04-16 | 68.181 | 83.391 |
| 2019-04-15 | 68.146 | 83.44 |
| 2019-04-12 | 68.189 | 83.005 |
| 2019-04-11 | 67.741 | 83.01 |
| 2019-04-10 | 67.739 | 82.324 |
| 2019-04-09 | 67.504 | 80.682 |
| 2019-04-08 | 67.916 | 80.527 |
| 2019-04-05 | 67.845 | 80.329 |
| 2019-04-04 | 67.532 | 79.711 |
| 2019-04-03 | 67.391 | 80.484 |
| 2019-04-02 | 67.247 | 79.373 |
| 2019-04-01 | 67.246 | 79.117 |
| 2019-03-29 | 66.477 | 75.254 |
| 2019-03-28 | 66.032 | 73.906 |
| 2019-03-27 | 65.796 | 73.94 |
| 2019-03-26 | 66.103 | 75.297 |
| 2019-03-25 | 65.631 | 74.708 |
| 2019-03-22 | 65.687 | 74.481 |
| 2019-03-21 | 66.957 | 76.702 |
| 2019-03-20 | 66.238 | 74.524 |
| 2019-03-19 | 66.434 | 74.906 |
| 2019-03-18 | 66.442 | 74.302 |
| 2019-03-15 | 66.197 | 74.027 |
| 2019-03-14 | 65.869 | 73.964 |
| 2019-03-13 | 65.926 | 74.075 |
| 2019-03-12 | 65.471 | 74.766 |
| 2019-03-11 | 65.278 | 74.394 |
| 2019-03-08 | 64.335 | 73.587 |
| 2019-03-07 | 64.472 | 73.781 |
| 2019-03-06 | 65 | 74.138 |
| 2019-03-05 | 65.427 | 74.717 |
| 2019-03-04 | 65.501 | 76.205 |
| 2019-03-01 | 65.756 | 77.161 |
| 2019-02-28 | 65.306 | 78.726 |
| 2019-02-27 | 65.491 | 79.339 |
| 2019-02-26 | 65.527 | 78.871 |
| 2019-02-25 | 65.579 | 79.175 |
| 2019-02-22 | 65.498 | 78.002 |
| 2019-02-21 | 65.081 | 77.19 |
| 2019-02-20 | 65.311 | 77.176 |
| 2019-02-19 | 65.195 | 77.601 |
| 2019-02-15 | 65.098 | 77.441 |
| 2019-02-14 | 64.397 | 77.243 |
| 2019-02-13 | 64.568 | 77.287 |
| 2019-02-12 | 64.374 | 77.05 |
| 2019-02-11 | 63.554 | 74.65 |
| 2019-02-08 | 63.509 | 74.524 |
| 2019-02-07 | 63.466 | 72.713 |
| 2019-02-06 | 64.066 | 73.544 |
| 2019-02-05 | 64.209 | 73.612 |
| 2019-02-04 | 63.908 | 73.211 |
| 2019-02-01 | 63.478 | 71.994 |
| 2019-01-31 | 63.421 | 71.091 |
| 2019-01-30 | 62.88 | 70.511 |
| 2019-01-29 | 61.917 | 67.691 |
| 2019-01-28 | 62.008 | 67.985 |
| 2019-01-25 | 62.498 | 68.618 |
| 2019-01-24 | 61.972 | 65.706 |
| 2019-01-23 | 61.887 | 66.401 |
| 2019-01-22 | 61.751 | 67.159 |
| 2019-01-18 | 62.638 | 68.449 |
| 2019-01-17 | 61.823 | 65.923 |
| 2019-01-16 | 61.357 | 65.343 |
| 2019-01-15 | 61.221 | 65.623 |
| 2019-01-14 | 60.571 | 65.078 |
| 2019-01-11 | 60.891 | 66.039 |
| 2019-01-10 | 60.9 | 66.024 |
| 2019-01-09 | 60.626 | 66.053 |
| 2019-01-08 | 60.379 | 64.653 |
| 2019-01-07 | 59.799 | 64.097 |
| 2019-01-04 | 59.383 | 61.953 |
| 2019-01-03 | 57.412 | 58.848 |
| 2019-01-02 | 58.869 | 62.281 |
| 2018-12-31 | 58.794 | 62.112 |
| 2018-12-28 | 58.299 | 61.446 |
| 2018-12-27 | 58.372 | 61.533 |
| 2018-12-26 | 57.876 | 60.818 |
| 2018-12-24 | 55.142 | 57.143 |
| 2018-12-21 | 56.678 | 58.099 |
| 2018-12-20 | 57.87 | 60.335 |
| 2018-12-19 | 58.797 | 61.881 |
| 2018-12-18 | 59.716 | 63.064 |
| 2018-12-17 | 59.711 | 61.465 |
| 2018-12-14 | 60.978 | 63.508 |
| 2018-12-13 | 62.165 | 65.474 |
| 2018-12-12 | 62.177 | 66.546 |
| 2018-12-11 | 61.842 | 64.653 |
| 2018-12-10 | 61.864 | 65.208 |
| 2018-12-07 | 61.755 | 64.025 |
| 2018-12-06 | 63.23 | 67.681 |
| 2018-12-04 | 63.326 | 67.536 |
| 2018-12-03 | 65.444 | 71.487 |
| 2018-11-30 | 64.736 | 69.787 |
| 2018-11-29 | 64.21 | 70.294 |
| 2018-11-28 | 64.352 | 69.139 |
| 2018-11-27 | 62.906 | 67.691 |
| 2018-11-26 | 62.702 | 67.034 |
| 2018-11-23 | 61.743 | 64.083 |
| 2018-11-21 | 62.15 | 65.218 |
| 2018-11-20 | 61.962 | 59.427 |
| 2018-11-19 | 63.107 | 60.726 |
| 2018-11-16 | 64.175 | 64.735 |
| 2018-11-15 | 64.033 | 64.856 |
| 2018-11-14 | 63.362 | 62.508 |
| 2018-11-13 | 63.845 | 63.228 |
| 2018-11-12 | 63.939 | 62.837 |
| 2018-11-09 | 65.225 | 65.464 |
| 2018-11-08 | 65.83 | 67.908 |
| 2018-11-07 | 65.996 | 67.092 |
| 2018-11-06 | 64.625 | 64.571 |
| 2018-11-05 | 64.223 | 64.474 |
| 2018-11-02 | 63.865 | 64.778 |
| 2018-11-01 | 64.271 | 65.31 |
| 2018-10-31 | 63.6 | 62.422 |
| 2018-10-30 | 62.917 | 60.833 |
| 2018-10-29 | 61.947 | 59.949 |
| 2018-10-26 | 62.356 | 60.229 |
| 2018-10-25 | 63.455 | 62.789 |
| 2018-10-24 | 62.295 | 60.33 |
| 2018-10-23 | 64.279 | 64.773 |
| 2018-10-22 | 64.635 | 65.508 |
| 2018-10-19 | 64.914 | 64.32 |
| 2018-10-18 | 64.938 | 66.304 |
| 2018-10-17 | 65.886 | 68.468 |
| 2018-10-16 | 65.903 | 68.299 |
| 2018-10-15 | 64.516 | 65.005 |
| 2018-10-12 | 64.899 | 66.734 |
| 2018-10-11 | 63.99 | 63.214 |
| 2018-10-10 | 65.334 | 64.474 |
| 2018-10-09 | 67.554 | 68.994 |
| 2018-10-08 | 67.65 | 70.612 |